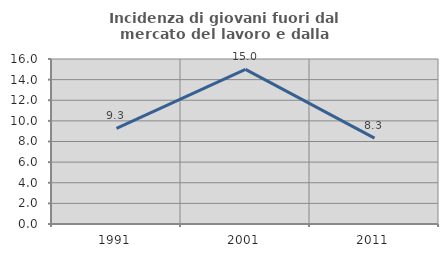
| Category | Incidenza di giovani fuori dal mercato del lavoro e dalla formazione  |
|---|---|
| 1991.0 | 9.272 |
| 2001.0 | 15 |
| 2011.0 | 8.333 |